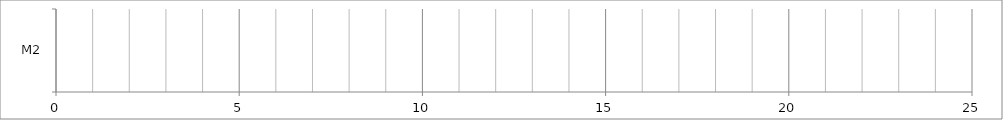
| Category | X | 0 |
|---|---|---|
| M2 | 0 | 0 |